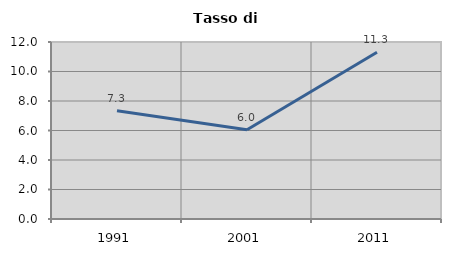
| Category | Tasso di disoccupazione   |
|---|---|
| 1991.0 | 7.339 |
| 2001.0 | 6.049 |
| 2011.0 | 11.299 |